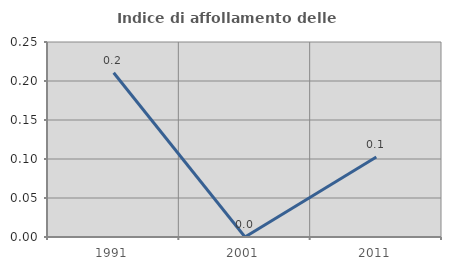
| Category | Indice di affollamento delle abitazioni  |
|---|---|
| 1991.0 | 0.211 |
| 2001.0 | 0 |
| 2011.0 | 0.103 |